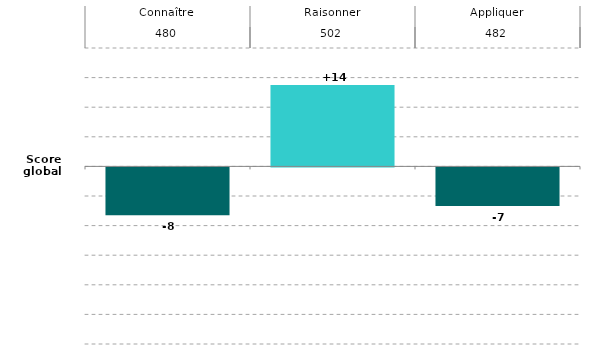
| Category | Series 0 |
|---|---|
| 0 | -8.095 |
| 1 | 13.763 |
| 2 | -6.513 |